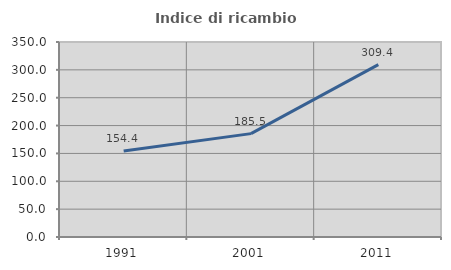
| Category | Indice di ricambio occupazionale  |
|---|---|
| 1991.0 | 154.357 |
| 2001.0 | 185.537 |
| 2011.0 | 309.412 |